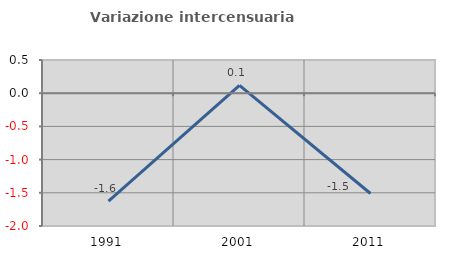
| Category | Variazione intercensuaria annua |
|---|---|
| 1991.0 | -1.625 |
| 2001.0 | 0.116 |
| 2011.0 | -1.511 |